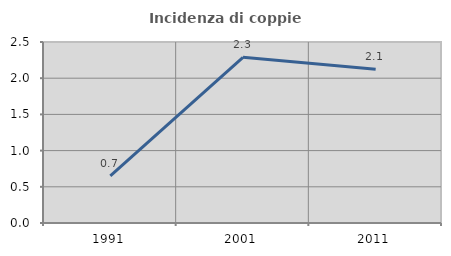
| Category | Incidenza di coppie miste |
|---|---|
| 1991.0 | 0.651 |
| 2001.0 | 2.289 |
| 2011.0 | 2.124 |